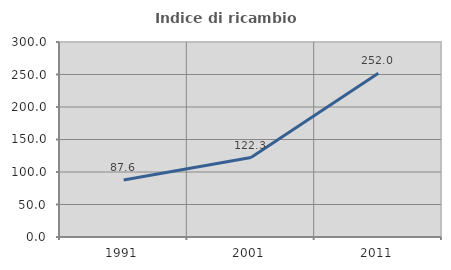
| Category | Indice di ricambio occupazionale  |
|---|---|
| 1991.0 | 87.634 |
| 2001.0 | 122.29 |
| 2011.0 | 251.987 |